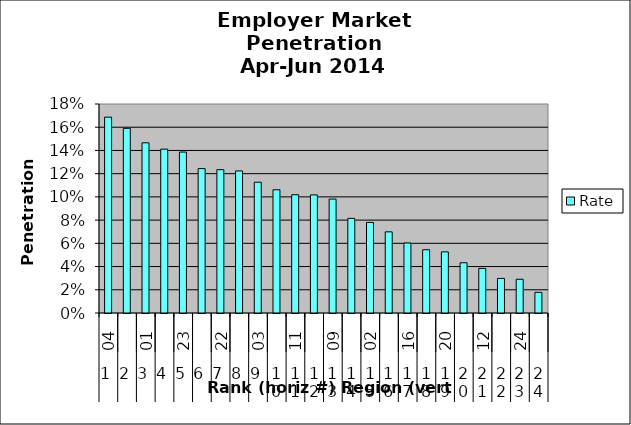
| Category | Rate |
|---|---|
| 0 | 0.169 |
| 1 | 0.159 |
| 2 | 0.147 |
| 3 | 0.141 |
| 4 | 0.139 |
| 5 | 0.124 |
| 6 | 0.123 |
| 7 | 0.122 |
| 8 | 0.113 |
| 9 | 0.106 |
| 10 | 0.102 |
| 11 | 0.102 |
| 12 | 0.098 |
| 13 | 0.081 |
| 14 | 0.078 |
| 15 | 0.07 |
| 16 | 0.06 |
| 17 | 0.054 |
| 18 | 0.053 |
| 19 | 0.043 |
| 20 | 0.038 |
| 21 | 0.03 |
| 22 | 0.029 |
| 23 | 0.018 |